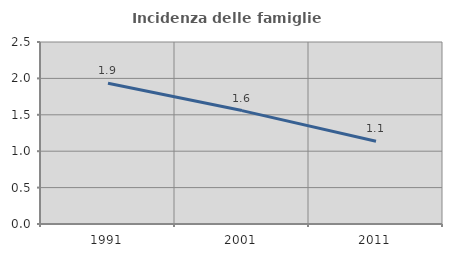
| Category | Incidenza delle famiglie numerose |
|---|---|
| 1991.0 | 1.933 |
| 2001.0 | 1.558 |
| 2011.0 | 1.137 |